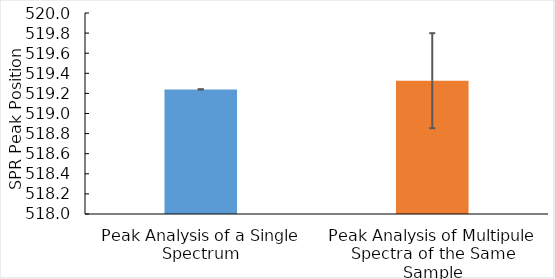
| Category | Series 0 |
|---|---|
| Peak Analysis of a Single Spectrum | 519.24 |
| Peak Analysis of Multipule Spectra of the Same Sample | 519.326 |